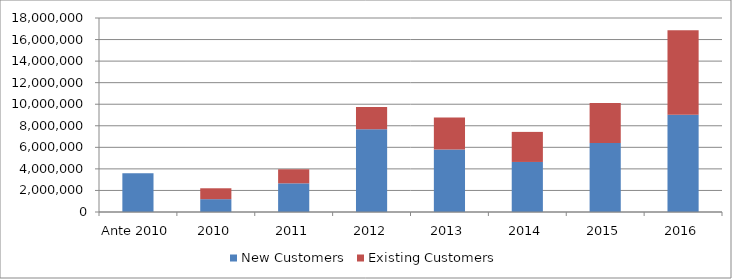
| Category | New Customers | Existing Customers |
|---|---|---|
| Ante 2010 | 3592750 | 0 |
| 2010 | 1190800 | 1010500 |
| 2011 | 2659800 | 1304271 |
| 2012 | 7680500 | 2064537 |
| 2013 | 5790900.19 | 2971238.873 |
| 2014 | 4643350.357 | 2789115.2 |
| 2015 | 6392725.694 | 3727438 |
| 2016 | 9022768.529 | 7845983.139 |